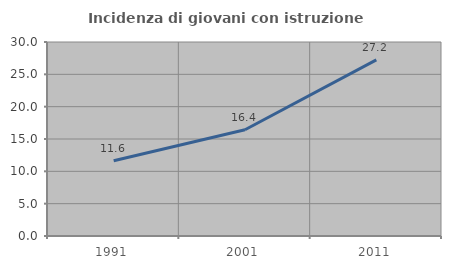
| Category | Incidenza di giovani con istruzione universitaria |
|---|---|
| 1991.0 | 11.626 |
| 2001.0 | 16.425 |
| 2011.0 | 27.239 |